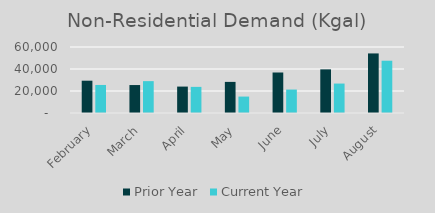
| Category | Prior Year | Current Year |
|---|---|---|
| February | 29366 | 25488 |
| March | 25412 | 28967 |
| April | 24018 | 23746 |
| May | 28279 | 14933 |
| June | 36817 | 21309 |
| July | 39671 | 26764 |
| August | 54156 | 47532 |